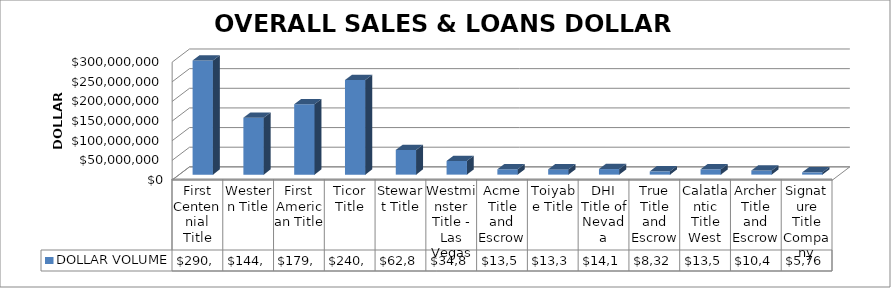
| Category | DOLLAR VOLUME |
|---|---|
| First Centennial Title | 290609111 |
| Western Title | 144803175.5 |
| First American Title | 179107832 |
| Ticor Title | 240762932.82 |
| Stewart Title | 62847465 |
| Westminster Title - Las Vegas | 34875406 |
| Acme Title and Escrow | 13598464 |
| Toiyabe Title | 13359690 |
| DHI Title of Nevada | 14164041 |
| True Title and Escrow | 8322898 |
| Calatlantic Title West | 13513796 |
| Archer Title and Escrow | 10479750 |
| Signature Title Company | 5763939 |